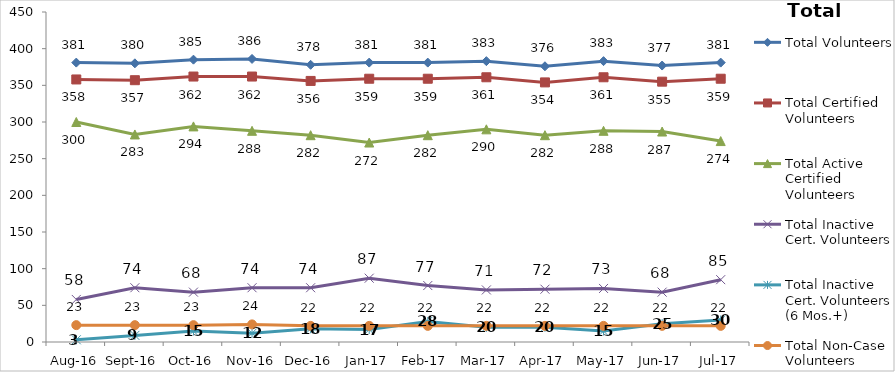
| Category | Total Volunteers | Total Certified Volunteers | Total Active Certified Volunteers | Total Inactive Cert. Volunteers | Total Inactive Cert. Volunteers (6 Mos.+) | Total Non-Case Volunteers |
|---|---|---|---|---|---|---|
| Aug-16 | 381 | 358 | 300 | 58 | 3 | 23 |
| Sep-16 | 380 | 357 | 283 | 74 | 9 | 23 |
| Oct-16 | 385 | 362 | 294 | 68 | 15 | 23 |
| Nov-16 | 386 | 362 | 288 | 74 | 12 | 24 |
| Dec-16 | 378 | 356 | 282 | 74 | 18 | 22 |
| Jan-17 | 381 | 359 | 272 | 87 | 17 | 22 |
| Feb-17 | 381 | 359 | 282 | 77 | 28 | 22 |
| Mar-17 | 383 | 361 | 290 | 71 | 20 | 22 |
| Apr-17 | 376 | 354 | 282 | 72 | 20 | 22 |
| May-17 | 383 | 361 | 288 | 73 | 15 | 22 |
| Jun-17 | 377 | 355 | 287 | 68 | 25 | 22 |
| Jul-17 | 381 | 359 | 274 | 85 | 30 | 22 |